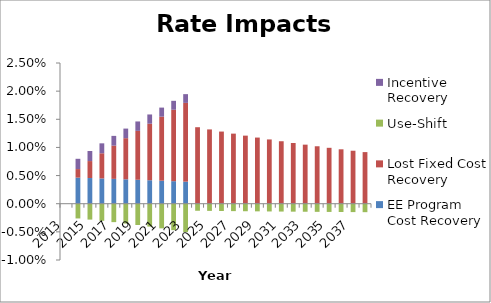
| Category | EE Program Cost Recovery | Lost Fixed Cost Recovery | Use-Shift | Incentive Recovery |
|---|---|---|---|---|
| 2013.0 | 0 | 0 | 0 | 0 |
| 2014.0 | 0.005 | 0.002 | -0.003 | 0.002 |
| 2015.0 | 0.005 | 0.003 | -0.003 | 0.002 |
| 2016.0 | 0.004 | 0.004 | -0.003 | 0.002 |
| 2017.0 | 0.004 | 0.006 | -0.003 | 0.002 |
| 2018.0 | 0.004 | 0.007 | -0.004 | 0.002 |
| 2019.0 | 0.004 | 0.009 | -0.004 | 0.002 |
| 2020.0 | 0.004 | 0.01 | -0.004 | 0.002 |
| 2021.0 | 0.004 | 0.011 | -0.004 | 0.002 |
| 2022.0 | 0.004 | 0.013 | -0.005 | 0.002 |
| 2023.0 | 0.004 | 0.014 | -0.005 | 0.002 |
| 2024.0 | 0 | 0.014 | -0.001 | 0 |
| 2025.0 | 0 | 0.013 | -0.001 | 0 |
| 2026.0 | 0 | 0.013 | -0.001 | 0 |
| 2027.0 | 0 | 0.012 | -0.001 | 0 |
| 2028.0 | 0 | 0.012 | -0.001 | 0 |
| 2029.0 | 0 | 0.012 | -0.001 | 0 |
| 2030.0 | 0 | 0.011 | -0.001 | 0 |
| 2031.0 | 0 | 0.011 | -0.001 | 0 |
| 2032.0 | 0 | 0.011 | -0.001 | 0 |
| 2033.0 | 0 | 0.01 | -0.001 | 0 |
| 2034.0 | 0 | 0.01 | -0.001 | 0 |
| 2035.0 | 0 | 0.01 | -0.001 | 0 |
| 2036.0 | 0 | 0.01 | -0.001 | 0 |
| 2037.0 | 0 | 0.009 | -0.001 | 0 |
| 2038.0 | 0 | 0.009 | -0.002 | 0 |